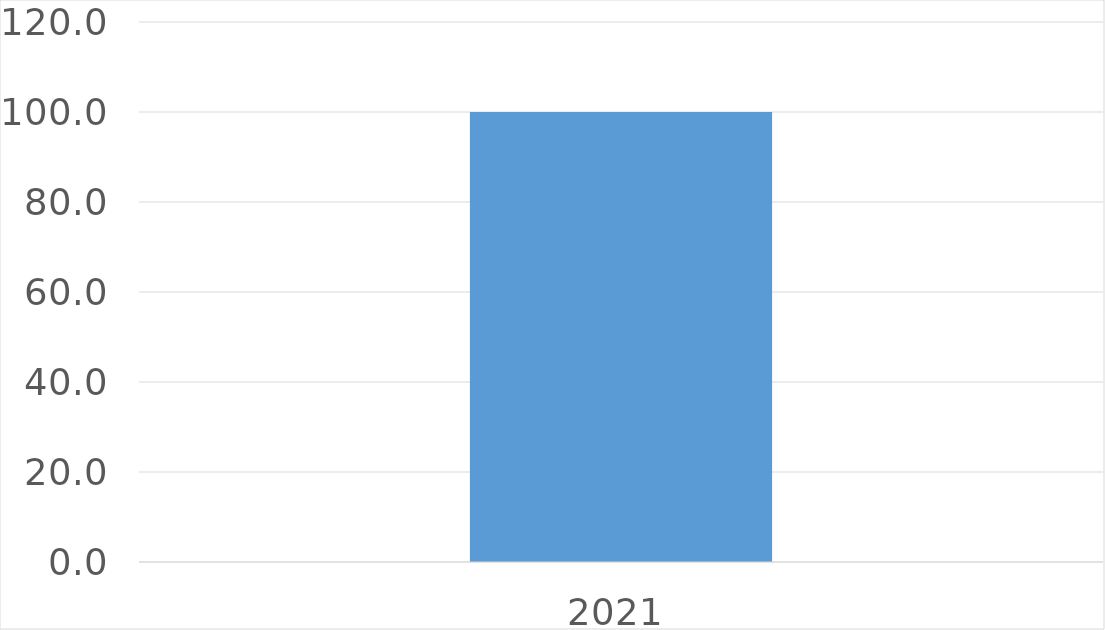
| Category | Series 0 |
|---|---|
| 2021 | 100 |